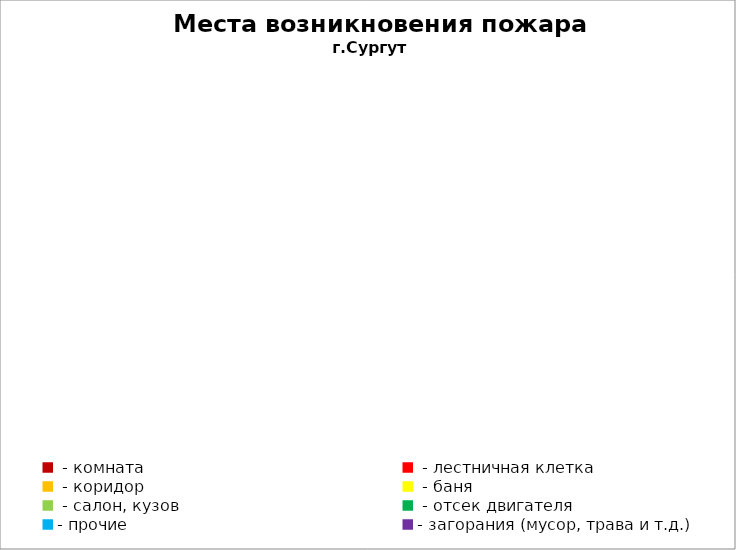
| Category | Места возникновения пожара |
|---|---|
|  - комната | 19 |
|  - лестничная клетка | 2 |
|  - коридор | 5 |
|  - баня | 3 |
|  - салон, кузов | 7 |
|  - отсек двигателя | 26 |
| - прочие | 61 |
| - загорания (мусор, трава и т.д.)  | 29 |